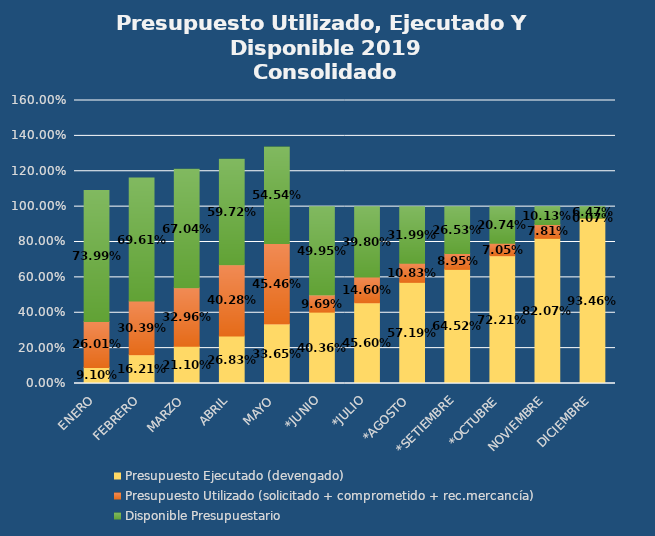
| Category | Presupuesto Ejecutado (devengado) | Presupuesto Utilizado (solicitado + comprometido + rec.mercancía) | Disponible Presupuestario |
|---|---|---|---|
| ENERO | 0.091 | 0.26 | 0.74 |
| FEBRERO | 0.162 | 0.304 | 0.696 |
| MARZO | 0.211 | 0.33 | 0.67 |
| ABRIL | 0.268 | 0.403 | 0.597 |
| MAYO | 0.337 | 0.455 | 0.545 |
| *JUNIO | 0.404 | 0.097 | 0.5 |
| *JULIO | 0.456 | 0.146 | 0.398 |
| *AGOSTO | 0.572 | 0.108 | 0.32 |
| *SETIEMBRE | 0.645 | 0.089 | 0.265 |
| *OCTUBRE | 0.722 | 0.07 | 0.207 |
| NOVIEMBRE | 0.821 | 0.078 | 0.101 |
| DICIEMBRE | 0.935 | 0.001 | 0.065 |